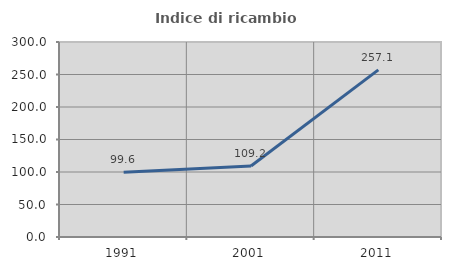
| Category | Indice di ricambio occupazionale  |
|---|---|
| 1991.0 | 99.648 |
| 2001.0 | 109.155 |
| 2011.0 | 257.071 |